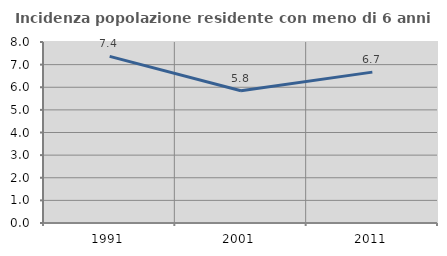
| Category | Incidenza popolazione residente con meno di 6 anni |
|---|---|
| 1991.0 | 7.364 |
| 2001.0 | 5.847 |
| 2011.0 | 6.669 |